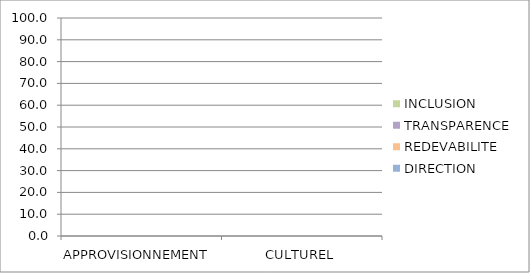
| Category | INCLUSION | TRANSPARENCE | REDEVABILITE | DIRECTION |
|---|---|---|---|---|
| APPROVISIONNEMENT  | 0 | 0 | 0 | 0 |
| CULTUREL | 0 | 0 | 0 | 0 |